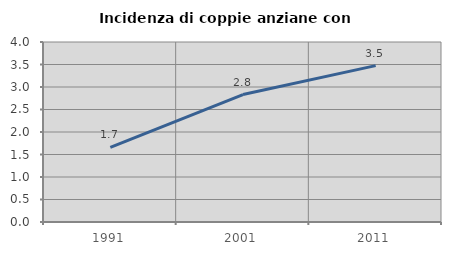
| Category | Incidenza di coppie anziane con figli |
|---|---|
| 1991.0 | 1.659 |
| 2001.0 | 2.832 |
| 2011.0 | 3.474 |